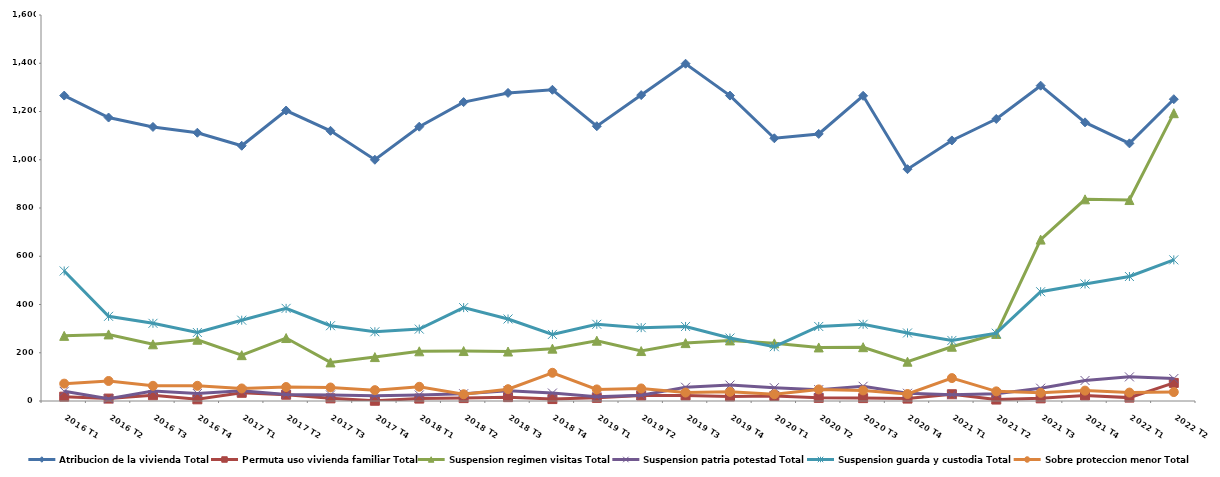
| Category | Atribucion de la vivienda Total | Permuta uso vivienda familiar Total | Suspension regimen visitas Total | Suspension patria potestad Total | Suspension guarda y custodia Total | Sobre proteccion menor Total |
|---|---|---|---|---|---|---|
| 2016 T1 | 1266 | 18 | 270 | 40 | 539 | 72 |
| 2016 T2 | 1175 | 10 | 276 | 9 | 351 | 83 |
| 2016 T3 | 1136 | 24 | 235 | 41 | 322 | 63 |
| 2016 T4 | 1112 | 7 | 254 | 31 | 284 | 63 |
| 2017 T1 | 1058 | 34 | 190 | 42 | 335 | 52 |
| 2017 T2 | 1204 | 26 | 261 | 27 | 384 | 58 |
| 2017 T3 | 1120 | 11 | 160 | 25 | 312 | 56 |
| 2017 T4 | 1000 | 1 | 182 | 22 | 287 | 45 |
| 2018 T1 | 1137 | 10 | 206 | 25 | 298 | 59 |
| 2018 T2 | 1239 | 12 | 207 | 30 | 387 | 28 |
| 2018 T3 | 1277 | 16 | 205 | 42 | 340 | 49 |
| 2018 T4 | 1290 | 8 | 217 | 33 | 276 | 117 |
| 2019 T1 | 1139 | 13 | 250 | 18 | 318 | 48 |
| 2019 T2 | 1268 | 23 | 207 | 24 | 304 | 52 |
| 2019 T3 | 1398 | 23 | 240 | 57 | 309 | 35 |
| 2019 T4 | 1266 | 19 | 251 | 66 | 261 | 38 |
| 2020 T1 | 1089 | 21 | 239 | 55 | 225 | 28 |
| 2020 T2 | 1107 | 13 | 222 | 47 | 309 | 48 |
| 2020 T3 | 1265 | 12 | 223 | 61 | 318 | 44 |
| 2020 T4 | 961 | 10 | 163 | 32 | 282 | 29 |
| 2021 T1 | 1080 | 28 | 225 | 26 | 251 | 95 |
| 2021 T2 | 1169 | 6 | 278 | 30 | 281 | 40 |
| 2021 T3 | 1307 | 11 | 669 | 53 | 453 | 34 |
| 2021 T4 | 1155 | 23 | 836 | 85 | 485 | 43 |
| 2022 T1 | 1068 | 14 | 833 | 100 | 516 | 35 |
| 2022 T2 | 1251 | 75 | 1193 | 93 | 585 | 37 |